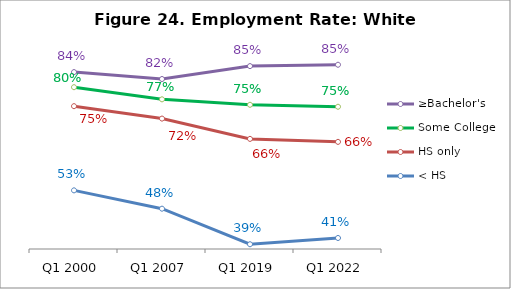
| Category | ≥Bachelor's | Some College | HS only | < HS |
|---|---|---|---|---|
| Q1 2000 | 0.835 | 0.796 | 0.747 | 0.531 |
| Q1 2007 | 0.817 | 0.765 | 0.716 | 0.484 |
| Q1 2019 | 0.85 | 0.751 | 0.663 | 0.392 |
| Q1 2022 | 0.854 | 0.746 | 0.656 | 0.408 |